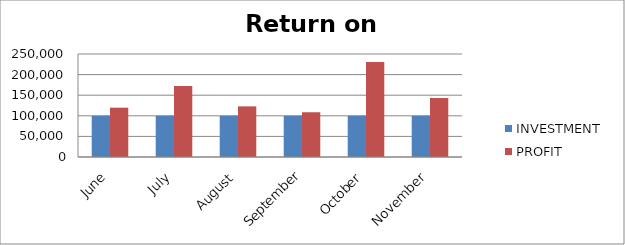
| Category | INVESTMENT  | PROFIT |
|---|---|---|
| June | 100000 | 119705 |
| July | 100000 | 172291 |
| August | 100000 | 122944 |
| September | 100000 | 108627 |
| October | 100000 | 230487 |
| November | 100000 | 143076 |